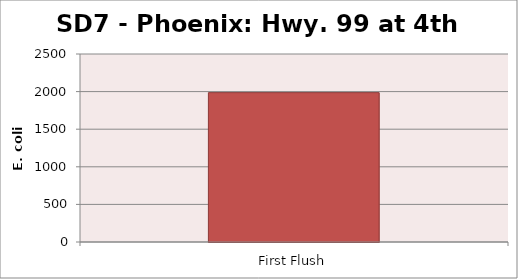
| Category | E. coli MPN |
|---|---|
| First Flush | 1986.3 |